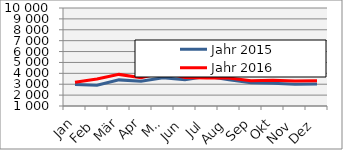
| Category | Jahr 2015 | Jahr 2016 |
|---|---|---|
| 0 | 2964.487 | 3175.049 |
| 1 | 2906.398 | 3488.906 |
| 2 | 3398.603 | 3902.514 |
| 3 | 3281.118 | 3595.877 |
| 4 | 3601.92 | 4072.546 |
| 5 | 3416.467 | 3609.385 |
| 6 | 3730.283 | 3563.661 |
| 7 | 3406.013 | 3576.196 |
| 8 | 3146.308 | 3319.34 |
| 9 | 3079.007 | 3353.831 |
| 10 | 2990.509 | 3300.037 |
| 11 | 3020.154 | 3323.955 |